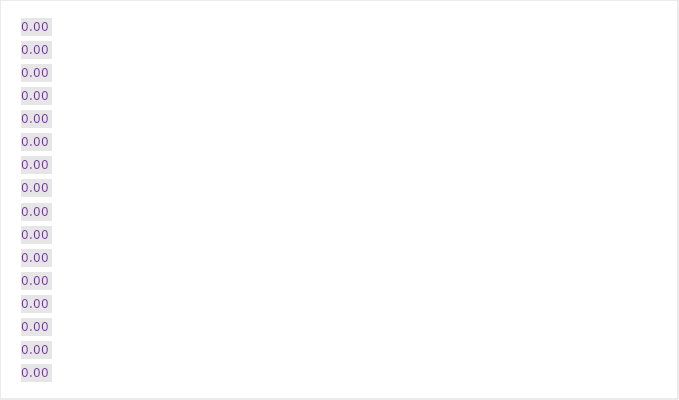
| Category | Series 3 |
|---|---|
| 0 | 0 |
| 1 | 0 |
| 2 | 0 |
| 3 | 0 |
| 4 | 0 |
| 5 | 0 |
| 6 | 0 |
| 7 | 0 |
| 8 | 0 |
| 9 | 0 |
| 10 | 0 |
| 11 | 0 |
| 12 | 0 |
| 13 | 0 |
| 14 | 0 |
| 15 | 0 |